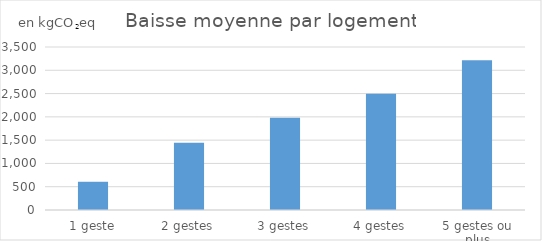
| Category | Baisse moyenne |
|---|---|
| 1 geste | 606.379 |
| 2 gestes | 1443.447 |
| 3 gestes | 1983.148 |
| 4 gestes | 2497.116 |
| 5 gestes ou plus | 3216.429 |